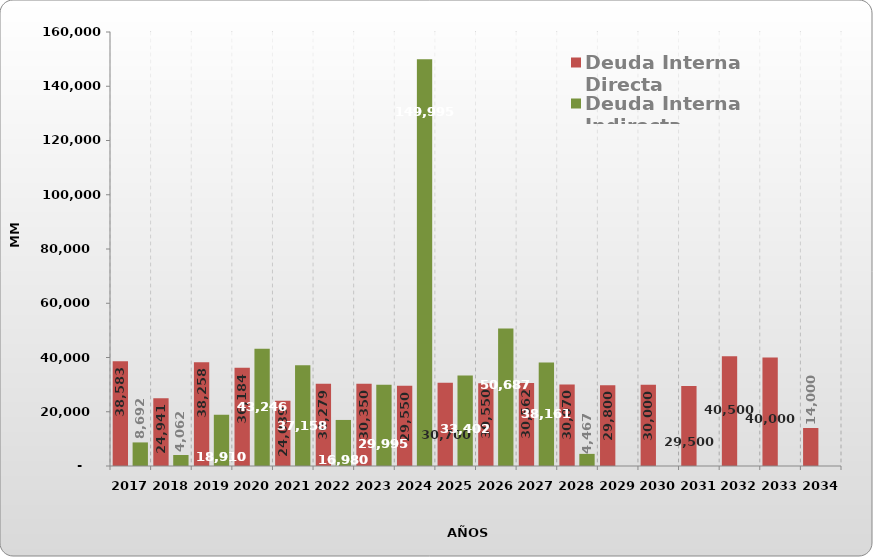
| Category | Deuda Interna Directa | Deuda Interna Indirecta |
|---|---|---|
| 2017.0 | 38583.362 | 8692.113 |
| 2018.0 | 24941.231 | 4062.481 |
| 2019.0 | 38257.991 | 18909.974 |
| 2020.0 | 36184.293 | 43246.154 |
| 2021.0 | 24038.607 | 37158.29 |
| 2022.0 | 30278.959 | 16979.963 |
| 2023.0 | 30350 | 29995.256 |
| 2024.0 | 29550 | 149995.256 |
| 2025.0 | 30700 | 33401.892 |
| 2026.0 | 30550 | 50686.549 |
| 2027.0 | 30561.643 | 38160.84 |
| 2028.0 | 30070.329 | 4467.091 |
| 2029.0 | 29800 | 0 |
| 2030.0 | 30000 | 0 |
| 2031.0 | 29500 | 0 |
| 2032.0 | 40500 | 0 |
| 2033.0 | 40000 | 0 |
| 2034.0 | 14000 | 0 |